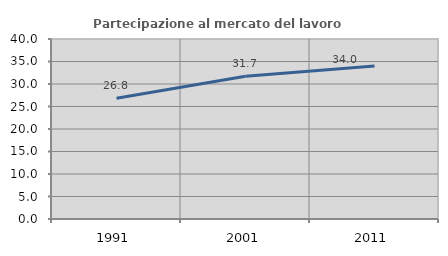
| Category | Partecipazione al mercato del lavoro  femminile |
|---|---|
| 1991.0 | 26.834 |
| 2001.0 | 31.743 |
| 2011.0 | 33.977 |